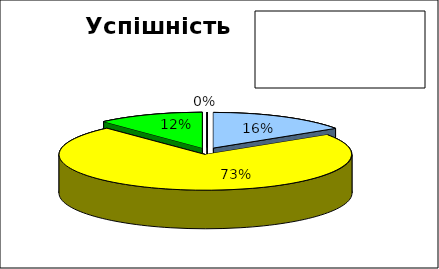
| Category | Series 0 |
|---|---|
| початковий | 0 |
| середній | 0.157 |
| достатній | 0.725 |
| високий | 0.118 |